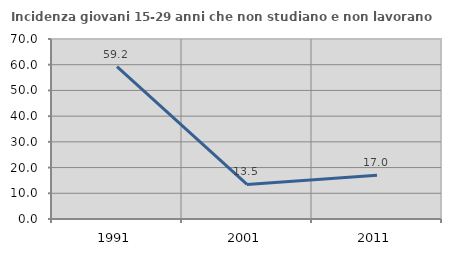
| Category | Incidenza giovani 15-29 anni che non studiano e non lavorano  |
|---|---|
| 1991.0 | 59.246 |
| 2001.0 | 13.454 |
| 2011.0 | 17.026 |